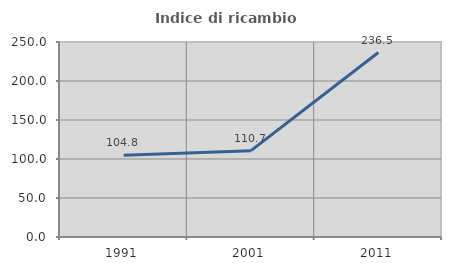
| Category | Indice di ricambio occupazionale  |
|---|---|
| 1991.0 | 104.833 |
| 2001.0 | 110.714 |
| 2011.0 | 236.478 |